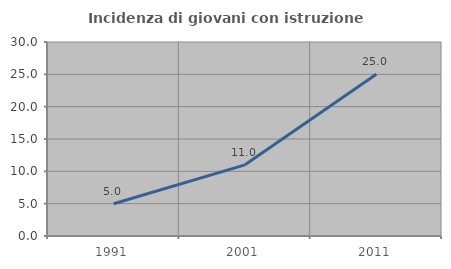
| Category | Incidenza di giovani con istruzione universitaria |
|---|---|
| 1991.0 | 4.979 |
| 2001.0 | 11.005 |
| 2011.0 | 25 |